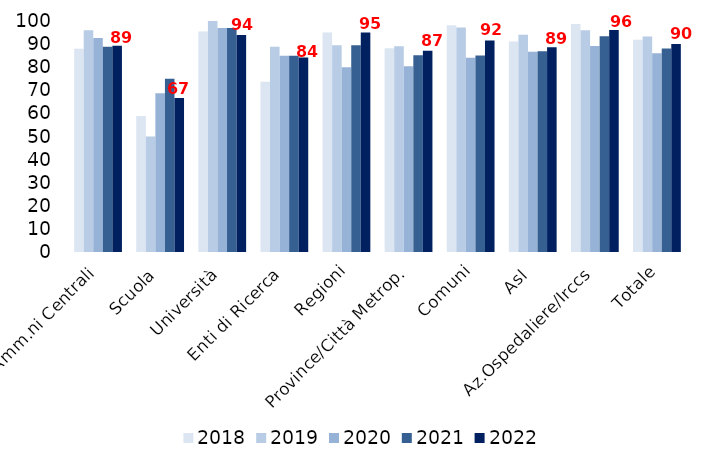
| Category | 2018 | 2019 | 2020 | 2021 | 2022 |
|---|---|---|---|---|---|
| Amm.ni Centrali | 88 | 96 | 92.593 | 88.889 | 89.286 |
| Scuola | 58.824 | 50 | 68.75 | 75 | 66.667 |
| Università | 95.455 | 100 | 96.923 | 96.97 | 93.939 |
| Enti di Ricerca | 73.684 | 88.889 | 85 | 85 | 84.211 |
| Regioni | 95 | 89.474 | 80 | 89.474 | 95 |
| Province/Città Metrop. | 88.235 | 89.109 | 80.392 | 85.149 | 87.129 |
| Comuni | 98.113 | 97.196 | 84.112 | 85.047 | 91.589 |
| Asl | 91.089 | 94 | 86.735 | 86.869 | 88.66 |
| Az.Ospedaliere/Irccs | 98.649 | 95.946 | 89.189 | 93.421 | 96.053 |
| Totale | 91.887 | 93.308 | 86.011 | 88.136 | 90.038 |